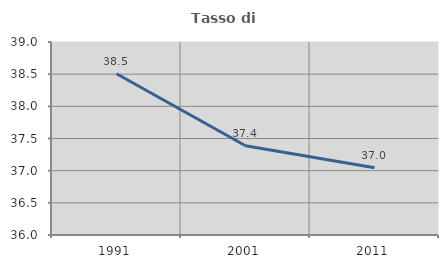
| Category | Tasso di occupazione   |
|---|---|
| 1991.0 | 38.506 |
| 2001.0 | 37.387 |
| 2011.0 | 37.045 |